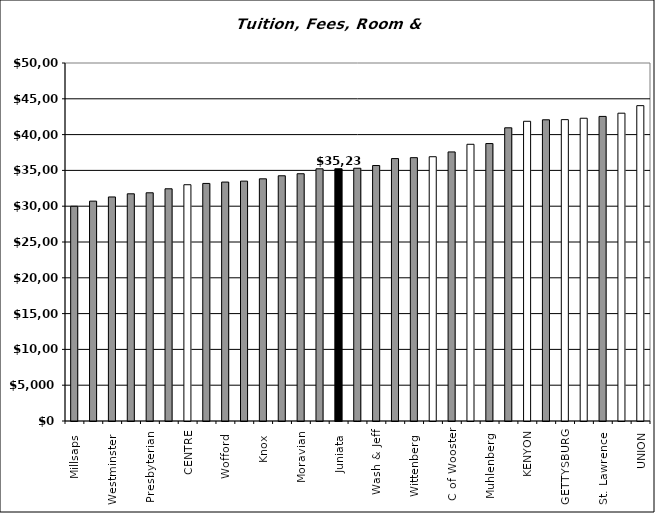
| Category | Series 0 |
|---|---|
| Millsaps  | 29988 |
| Birm Southern  | 30705 |
| Westminster  | 31290 |
| Augustana  | 31731 |
| Presbyterian  | 31872 |
| Lycoming  | 32431 |
| CENTRE | 33000 |
| McDaniel  | 33180 |
| Wofford  | 33370 |
| Leb Valley  | 33500 |
| Knox  | 33825 |
| Elizabethtown  | 34250 |
| Moravian | 34535 |
| Susquehanna  | 35220 |
| Juniata  | 35230 |
| Allegheny  | 35300 |
| Wash & Jeff | 35682 |
| Washington  | 36650 |
| Wittenberg  | 36778 |
| SEWANEE | 36910 |
| C of Wooster | 37580 |
| WHITMAN | 38646 |
| Muhlenberg  | 38750 |
| Ursinus  | 40950 |
| KENYON | 41860 |
| Drew  | 42068 |
| GETTYSBURG | 42090 |
| DICKINSON | 42284 |
| St. Lawrence  | 42540 |
| F & M * | 42990 |
| UNION | 44043 |